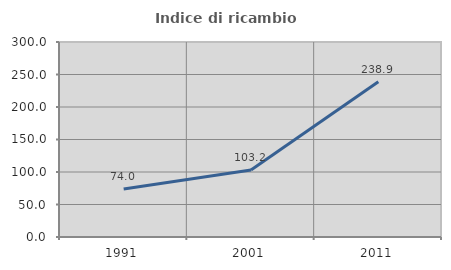
| Category | Indice di ricambio occupazionale  |
|---|---|
| 1991.0 | 73.967 |
| 2001.0 | 103.185 |
| 2011.0 | 238.931 |